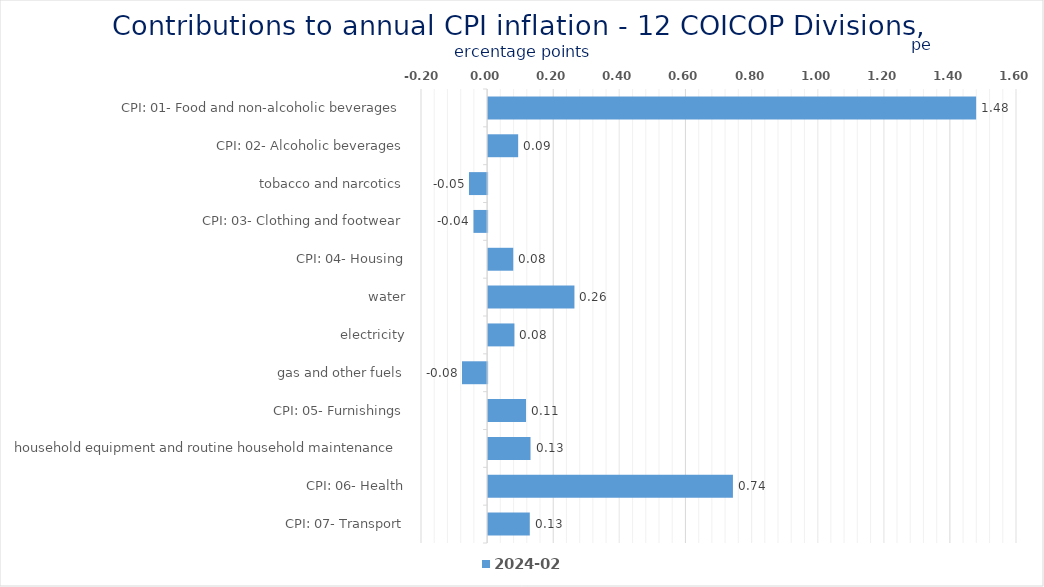
| Category | 2024-02 |
|---|---|
| CPI: 01- Food and non-alcoholic beverages | 1.476 |
| CPI: 02- Alcoholic beverages, tobacco and narcotics | 0.091 |
| CPI: 03- Clothing and footwear | -0.055 |
| CPI: 04- Housing, water, electricity, gas and other fuels | -0.041 |
| CPI: 05- Furnishings, household equipment and routine household maintenance | 0.076 |
| CPI: 06- Health | 0.261 |
| CPI: 07- Transport | 0.08 |
| CPI: 08- Communication | -0.076 |
| CPI: 09- Recreation and culture | 0.115 |
| CPI: 10- Education | 0.128 |
| CPI: 11- Restaurants and hotels | 0.741 |
| CPI: 12- Miscellaneous goods and services | 0.126 |